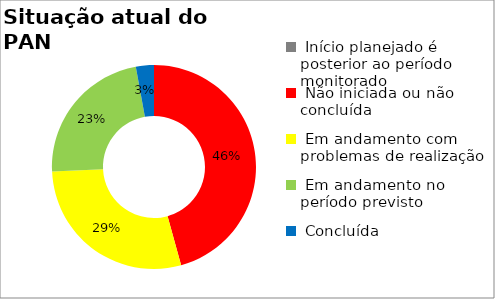
| Category | Series 0 |
|---|---|
|  Início planejado é posterior ao período monitorado | 0 |
|  Não iniciada ou não concluída | 0.457 |
|  Em andamento com problemas de realização | 0.286 |
|  Em andamento no período previsto  | 0.229 |
|  Concluída | 0.029 |